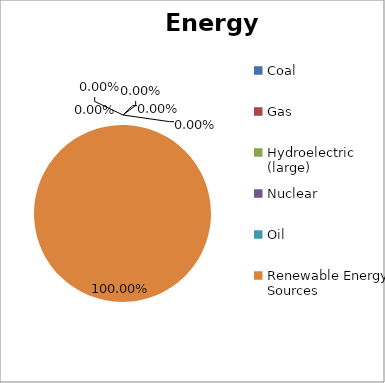
| Category | Energy Source |
|---|---|
| Coal | 0 |
| Gas | 0 |
| Hydroelectric (large) | 0 |
| Nuclear | 0 |
| Oil | 0 |
| Renewable Energy Sources | 1 |